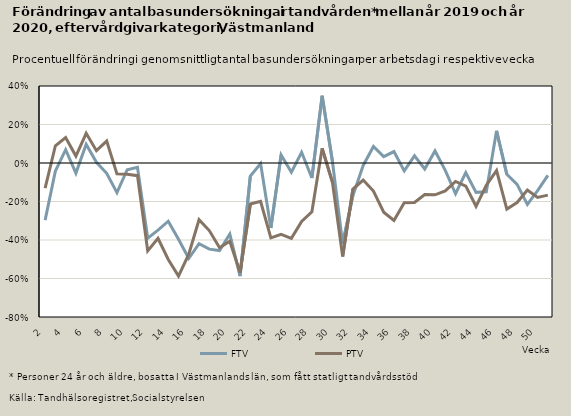
| Category | FTV | PTV |
|---|---|---|
| 2.0 | -0.297 | -0.131 |
| 3.0 | -0.042 | 0.09 |
| 4.0 | 0.069 | 0.132 |
| 5.0 | -0.052 | 0.036 |
| 6.0 | 0.097 | 0.154 |
| 7.0 | 0.004 | 0.064 |
| 8.0 | -0.053 | 0.114 |
| 9.0 | -0.154 | -0.057 |
| 10.0 | -0.035 | -0.058 |
| 11.0 | -0.022 | -0.066 |
| 12.0 | -0.39 | -0.456 |
| 13.0 | -0.348 | -0.391 |
| 14.0 | -0.302 | -0.501 |
| 15.0 | -0.396 | -0.587 |
| 16.0 | -0.496 | -0.474 |
| 17.0 | -0.419 | -0.295 |
| 18.0 | -0.448 | -0.351 |
| 19.0 | -0.455 | -0.44 |
| 20.0 | -0.369 | -0.406 |
| 21.0 | -0.588 | -0.568 |
| 22.0 | -0.068 | -0.213 |
| 23.0 | -0.002 | -0.199 |
| 24.0 | -0.338 | -0.389 |
| 25.0 | 0.042 | -0.371 |
| 26.0 | -0.048 | -0.391 |
| 27.0 | 0.056 | -0.303 |
| 28.0 | -0.078 | -0.254 |
| 29.0 | 0.349 | 0.076 |
| 30.0 | 0.009 | -0.099 |
| 31.0 | -0.419 | -0.486 |
| 32.0 | -0.169 | -0.135 |
| 33.0 | -0.013 | -0.089 |
| 34.0 | 0.086 | -0.145 |
| 35.0 | 0.033 | -0.256 |
| 36.0 | 0.06 | -0.299 |
| 37.0 | -0.041 | -0.206 |
| 38.0 | 0.037 | -0.205 |
| 39.0 | -0.031 | -0.164 |
| 40.0 | 0.063 | -0.165 |
| 41.0 | -0.038 | -0.145 |
| 42.0 | -0.16 | -0.096 |
| 43.0 | -0.05 | -0.12 |
| 44.0 | -0.153 | -0.225 |
| 45.0 | -0.149 | -0.116 |
| 46.0 | 0.167 | -0.039 |
| 47.0 | -0.059 | -0.239 |
| 48.0 | -0.111 | -0.205 |
| 49.0 | -0.215 | -0.14 |
| 50.0 | -0.143 | -0.179 |
| 51.0 | -0.064 | -0.167 |